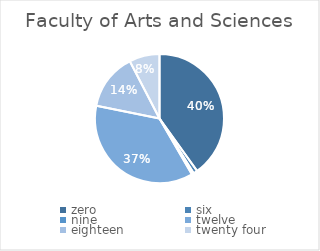
| Category | Series 0 |
|---|---|
| zero | 79 |
| six | 2 |
| nine | 1 |
| twelve | 72 |
| eighteen | 28 |
| twenty four | 15 |